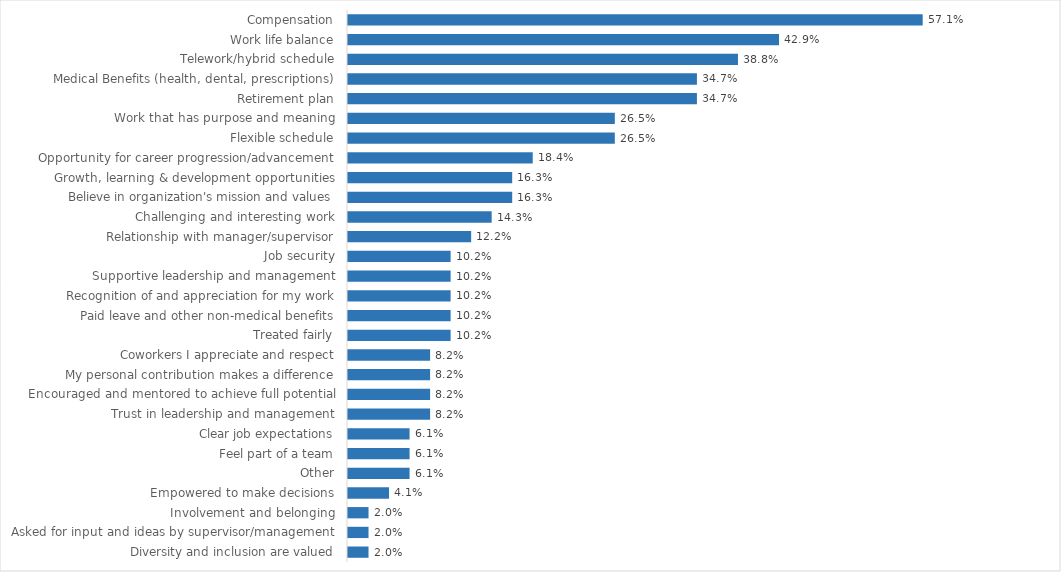
| Category | Public Service Department |
|---|---|
| Compensation | 0.571 |
| Work life balance | 0.429 |
| Telework/hybrid schedule | 0.388 |
| Medical Benefits (health, dental, prescriptions) | 0.347 |
| Retirement plan | 0.347 |
| Work that has purpose and meaning | 0.265 |
| Flexible schedule | 0.265 |
| Opportunity for career progression/advancement | 0.184 |
| Growth, learning & development opportunities | 0.163 |
| Believe in organization's mission and values | 0.163 |
| Challenging and interesting work | 0.143 |
| Relationship with manager/supervisor | 0.122 |
| Job security | 0.102 |
| Supportive leadership and management | 0.102 |
| Recognition of and appreciation for my work | 0.102 |
| Paid leave and other non-medical benefits | 0.102 |
| Treated fairly | 0.102 |
| Coworkers I appreciate and respect | 0.082 |
| My personal contribution makes a difference | 0.082 |
| Encouraged and mentored to achieve full potential | 0.082 |
| Trust in leadership and management | 0.082 |
| Clear job expectations | 0.061 |
| Feel part of a team | 0.061 |
| Other | 0.061 |
| Empowered to make decisions | 0.041 |
| Involvement and belonging | 0.02 |
| Asked for input and ideas by supervisor/management | 0.02 |
| Diversity and inclusion are valued | 0.02 |